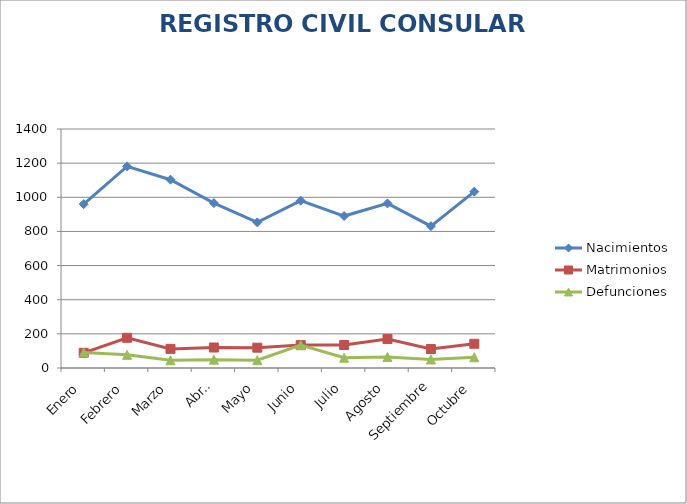
| Category | Nacimientos | Matrimonios | Defunciones |
|---|---|---|---|
| Enero | 960 | 89 | 91 |
| Febrero | 1181 | 177 | 77 |
| Marzo | 1103 | 112 | 45 |
| Abril | 966 | 120 | 49 |
| Mayo | 853 | 119 | 46 |
| Junio | 980 | 134 | 134 |
| Julio | 890 | 135 | 60 |
| Agosto | 964 | 170 | 64 |
| Septiembre | 831 | 111 | 50 |
| Octubre | 1033 | 142 | 63 |